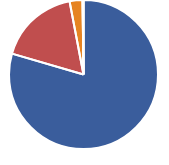
| Category | Series 0 |
|---|---|
| PI Payment | 1657.784 |
| Property Tax | 364.479 |
| Insurance | 58.317 |
| PMI | 0 |
| HOA | 4.17 |
| Other | 0 |